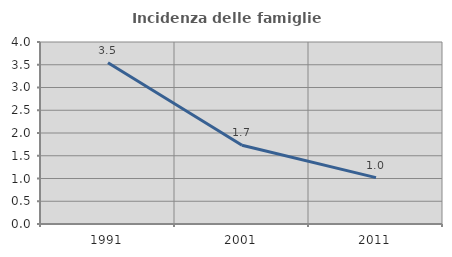
| Category | Incidenza delle famiglie numerose |
|---|---|
| 1991.0 | 3.546 |
| 2001.0 | 1.731 |
| 2011.0 | 1.019 |